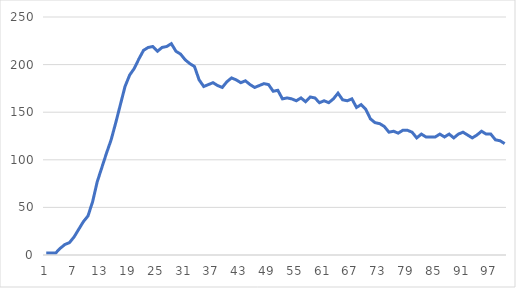
| Category | Series 0 |
|---|---|
| 0 | 2 |
| 1 | 2 |
| 2 | 2 |
| 3 | 7 |
| 4 | 11 |
| 5 | 13 |
| 6 | 19 |
| 7 | 27 |
| 8 | 35 |
| 9 | 41 |
| 10 | 56 |
| 11 | 77 |
| 12 | 92 |
| 13 | 107 |
| 14 | 121 |
| 15 | 139 |
| 16 | 158 |
| 17 | 177 |
| 18 | 189 |
| 19 | 196 |
| 20 | 206 |
| 21 | 215 |
| 22 | 218 |
| 23 | 219 |
| 24 | 214 |
| 25 | 218 |
| 26 | 219 |
| 27 | 222 |
| 28 | 214 |
| 29 | 211 |
| 30 | 205 |
| 31 | 201 |
| 32 | 198 |
| 33 | 184 |
| 34 | 177 |
| 35 | 179 |
| 36 | 181 |
| 37 | 178 |
| 38 | 176 |
| 39 | 182 |
| 40 | 186 |
| 41 | 184 |
| 42 | 181 |
| 43 | 183 |
| 44 | 179 |
| 45 | 176 |
| 46 | 178 |
| 47 | 180 |
| 48 | 179 |
| 49 | 172 |
| 50 | 173 |
| 51 | 164 |
| 52 | 165 |
| 53 | 164 |
| 54 | 162 |
| 55 | 165 |
| 56 | 161 |
| 57 | 166 |
| 58 | 165 |
| 59 | 160 |
| 60 | 162 |
| 61 | 160 |
| 62 | 164 |
| 63 | 170 |
| 64 | 163 |
| 65 | 162 |
| 66 | 164 |
| 67 | 155 |
| 68 | 158 |
| 69 | 153 |
| 70 | 143 |
| 71 | 139 |
| 72 | 138 |
| 73 | 135 |
| 74 | 129 |
| 75 | 130 |
| 76 | 128 |
| 77 | 131 |
| 78 | 131 |
| 79 | 129 |
| 80 | 123 |
| 81 | 127 |
| 82 | 124 |
| 83 | 124 |
| 84 | 124 |
| 85 | 127 |
| 86 | 124 |
| 87 | 127 |
| 88 | 123 |
| 89 | 127 |
| 90 | 129 |
| 91 | 126 |
| 92 | 123 |
| 93 | 126 |
| 94 | 130 |
| 95 | 127 |
| 96 | 127 |
| 97 | 121 |
| 98 | 120 |
| 99 | 117 |